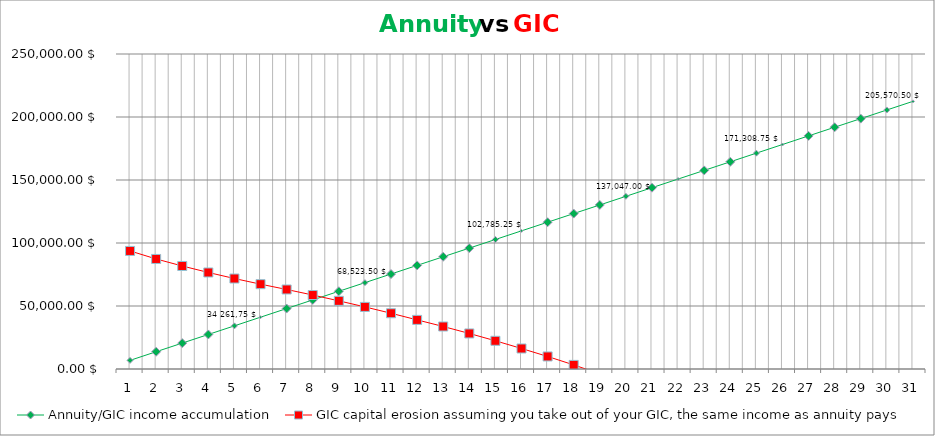
| Category | Annuity/GIC income accumulation | GIC capital erosion assuming you take out of your GIC, the same income as annuity pays |
|---|---|---|
| 0 | 6852.35 | 93696 |
| 1 | 13704.7 | 87330.536 |
| 2 | 20557.05 | 81754.481 |
| 3 | 27409.4 | 76601.098 |
| 4 | 34261.75 | 71811.634 |
| 5 | 41114.1 | 67333.287 |
| 6 | 47966.45 | 63117.952 |
| 7 | 54818.8 | 58710.819 |
| 8 | 61671.15 | 54103.161 |
| 9 | 68523.5 | 49285.855 |
| 10 | 75375.85 | 44249.361 |
| 11 | 82228.2 | 38983.707 |
| 12 | 89080.55 | 33731.86 |
| 13 | 95932.9 | 28206.917 |
| 14 | 102785.25 | 22394.676 |
| 15 | 109637.6 | 16280.199 |
| 16 | 116489.95 | 9953.591 |
| 17 | 123342.3 | 3256.876 |
| 18 | 130194.65 | -3831.596 |
| 19 | 137047 | -11334.745 |
| 20 | 143899.35 | -19276.827 |
| 21 | 150751.7 | -27683.522 |
| 22 | 157604.05 | -36582.008 |
| 23 | 164456.4 | -46001.055 |
| 24 | 171308.75 | -55971.117 |
| 25 | 178161.1 | -65432.991 |
| 26 | 185013.45 | -75263.877 |
| 27 | 191865.8 | -85478.169 |
| 28 | 198718.15 | -96090.817 |
| 29 | 205570.5 | -107117.359 |
| 30 | 212422.85 | -118573.936 |